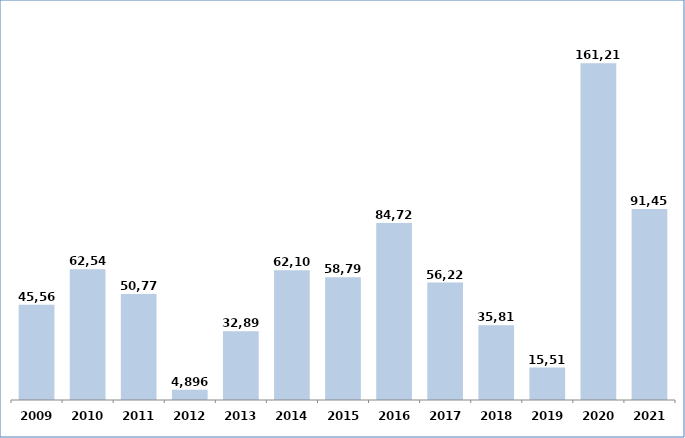
| Category | Series 0 |
|---|---|
| 2009 | 45568 |
| 2010 | 62540.91 |
| 2011 | 50772.98 |
| 2012 | 4895.88 |
| 2013 | 32890.28 |
| 2014 | 62107.56 |
| 2015 | 58792.11 |
| 2016 | 84720.81 |
| 2017 | 56222.44 |
| 2018 | 35819.49 |
| 2019 | 15514 |
| 2020 | 161217 |
| 2021 | 91450.545 |